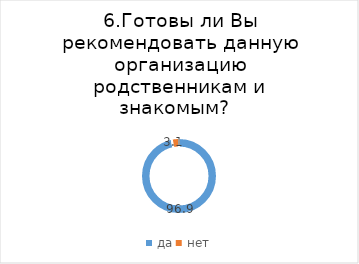
| Category | Series 0 |
|---|---|
| да | 96.884 |
| нет | 3.116 |